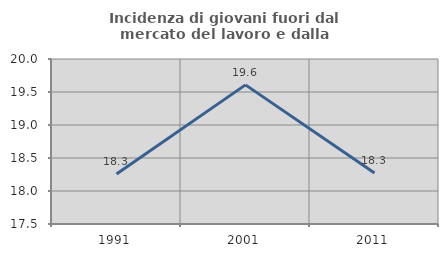
| Category | Incidenza di giovani fuori dal mercato del lavoro e dalla formazione  |
|---|---|
| 1991.0 | 18.258 |
| 2001.0 | 19.608 |
| 2011.0 | 18.274 |